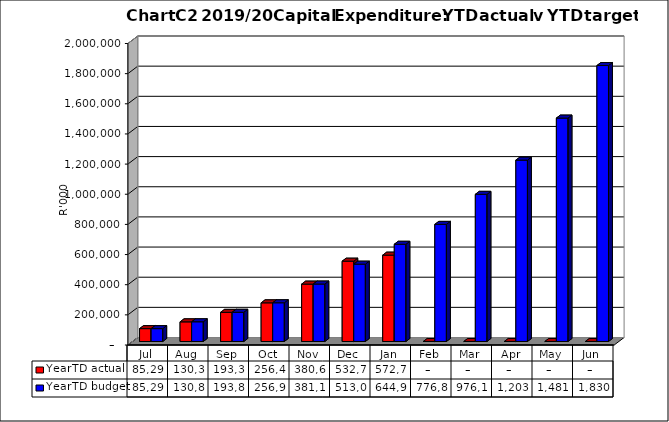
| Category | YearTD actual | YearTD budget |
|---|---|---|
| Jul | 85297669.12 | 85297669.12 |
| Aug | 130318368.449 | 130812960.887 |
| Sep | 193342853.058 | 193837445.496 |
| Oct | 256411156.37 | 256905748.808 |
| Nov | 380658882.037 | 381153474.478 |
| Dec | 532797066.826 | 513021474.478 |
| Jan | 572782393.705 | 644959474.478 |
| Feb | 0 | 776897474.478 |
| Mar | 0 | 976179474.478 |
| Apr | 0 | 1203170474.478 |
| May | 0 | 1481978474.478 |
| Jun | 0 | 1830632112 |